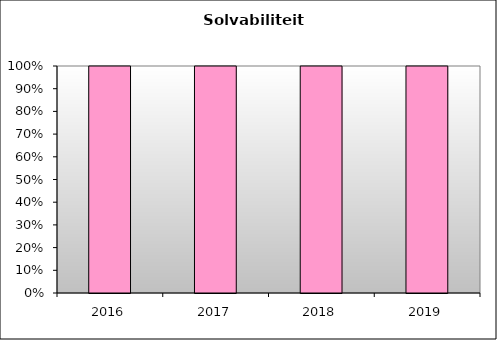
| Category | solv 2 |
|---|---|
| 2016.0 | 1 |
| 2017.0 | 1 |
| 2018.0 | 1 |
| 2019.0 | 1 |